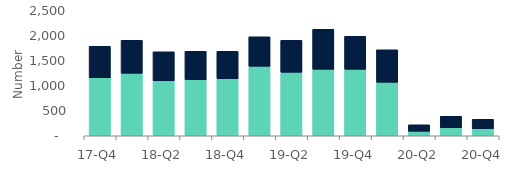
| Category | Homeowners | Buy-to-let |
|---|---|---|
| 17-Q4 | 1160 | 630 |
| 18-Q1 | 1250 | 660 |
| 18-Q2 | 1100 | 580 |
| 18-Q3 | 1120 | 570 |
| 18-Q4 | 1140 | 550 |
| 19-Q1 | 1390 | 590 |
| 19-Q2 | 1270 | 640 |
| 19-Q3 | 1330 | 800 |
| 19-Q4 | 1330 | 660 |
| 20-Q1 | 1070 | 650 |
| 20-Q2 | 90 | 130 |
| 20-Q3 | 160 | 230 |
| 20-Q4 | 140 | 190 |